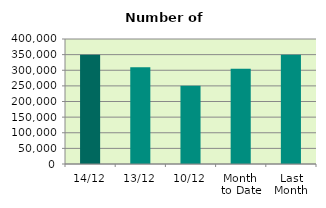
| Category | Series 0 |
|---|---|
| 14/12 | 349332 |
| 13/12 | 309286 |
| 10/12 | 250554 |
| Month 
to Date | 304568.4 |
| Last
Month | 349295 |